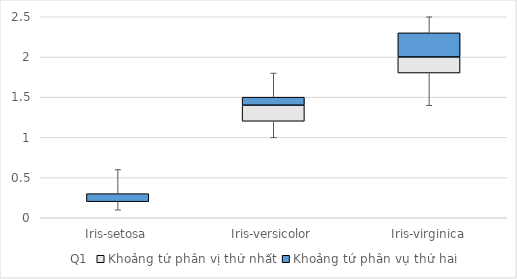
| Category | Q1 | Khoảng tứ phân vị thứ nhất | Khoảng tứ phân vụ thứ hai |
|---|---|---|---|
| Iris-setosa | 0.2 | 0 | 0.1 |
| Iris-versicolor | 1.2 | 0.2 | 0.1 |
| Iris-virginica | 1.8 | 0.2 | 0.3 |